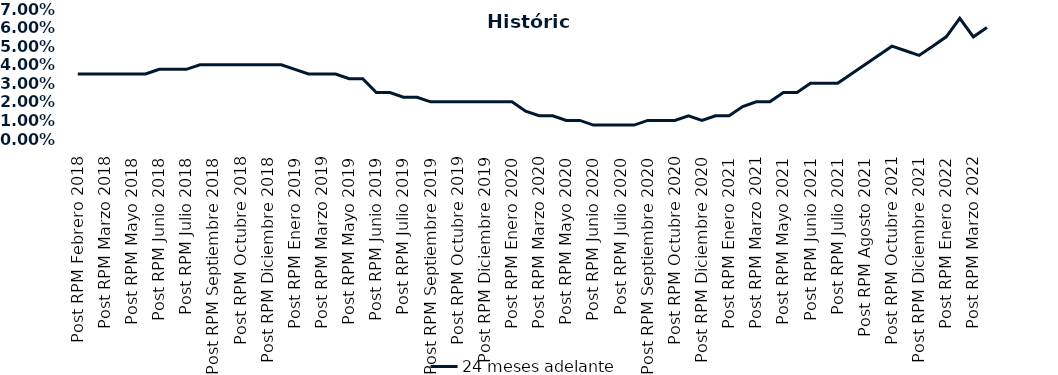
| Category | 24 meses adelante  |
|---|---|
| Post RPM Febrero 2018 | 0.035 |
| Pre RPM Marzo 2018 | 0.035 |
| Post RPM Marzo 2018 | 0.035 |
| Pre RPM Mayo 2018 | 0.035 |
| Post RPM Mayo 2018 | 0.035 |
| Pre RPM Junio 2018 | 0.035 |
| Post RPM Junio 2018 | 0.038 |
| Pre RPM Julio 2018 | 0.038 |
| Post RPM Julio 2018 | 0.038 |
| Pre RPM Septiembre 2018 | 0.04 |
| Post RPM Septiembre 2018 | 0.04 |
| Pre RPM Octubre 2018 | 0.04 |
| Post RPM Octubre 2018 | 0.04 |
| Pre RPM Diciembre 2018 | 0.04 |
| Post RPM Diciembre 2018 | 0.04 |
| Pre RPM Enero 2019 | 0.04 |
| Post RPM Enero 2019 | 0.038 |
| Pre RPM Marzo 2019 | 0.035 |
| Post RPM Marzo 2019 | 0.035 |
| Pre RPM Mayo 2019 | 0.035 |
| Post RPM Mayo 2019 | 0.032 |
| Pre RPM Junio 2019 | 0.032 |
| Post RPM Junio 2019 | 0.025 |
| Pre RPM Julio 2019 | 0.025 |
| Post RPM Julio 2019 | 0.022 |
| Pre RPM Septiembre 2019 | 0.022 |
| Post RPM Septiembre 2019 | 0.02 |
| Pre RPM Octubre 2019 | 0.02 |
| Post RPM Octubre 2019 | 0.02 |
| Pre RPM Diciembre 2019 | 0.02 |
| Post RPM Diciembre 2019 | 0.02 |
| Pre RPM Enero 2020 | 0.02 |
| Post RPM Enero 2020 | 0.02 |
| Pre RPM Marzo 2020 | 0.015 |
| Post RPM Marzo 2020 | 0.012 |
| Pre RPM Mayo 2020 | 0.012 |
| Post RPM Mayo 2020 | 0.01 |
| Pre RPM Junio 2020 | 0.01 |
| Post RPM Junio 2020 | 0.008 |
| Pre RPM Julio 2020 | 0.008 |
| Post RPM Julio 2020 | 0.008 |
| Pre RPM Septiembre 2020 | 0.008 |
| Post RPM Septiembre 2020 | 0.01 |
| Pre RPM Octubre 2020 | 0.01 |
| Post RPM Octubre 2020 | 0.01 |
| Pre RPM Diciembre 2020 | 0.012 |
| Post RPM Diciembre 2020 | 0.01 |
| Pre RPM Enero 2021 | 0.012 |
| Post RPM Enero 2021 | 0.012 |
| Pre RPM Marzo 2021 | 0.018 |
| Post RPM Marzo 2021 | 0.02 |
| Pre RPM Mayo 2021 | 0.02 |
| Post RPM Mayo 2021 | 0.025 |
| Pre RPM Junio 2021 | 0.025 |
| Post RPM Junio 2021 | 0.03 |
| Pre RPM Julio 2021 | 0.03 |
| Post RPM Julio 2021 | 0.03 |
| Pre RPM Agosto 2021 | 0.035 |
| Post RPM Agosto 2021 | 0.04 |
| Pre RPM Octubre 2021 | 0.045 |
| Post RPM Octubre 2021 | 0.05 |
| Pre RPM Diciembre 2021 | 0.048 |
| Post RPM Diciembre 2021 | 0.045 |
| Pre RPM Enero 2022 | 0.05 |
| Post RPM Enero 2022 | 0.055 |
| Pre RPM Marzo 2022 | 0.065 |
| Post RPM Marzo 2022 | 0.055 |
| Pre RPM Mayo 2022 | 0.06 |